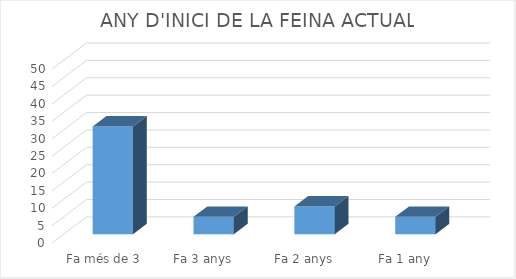
| Category | Series 0 |
|---|---|
| Fa més de 3 anys | 31 |
| Fa 3 anys | 5 |
| Fa 2 anys | 8 |
| Fa 1 any | 5 |